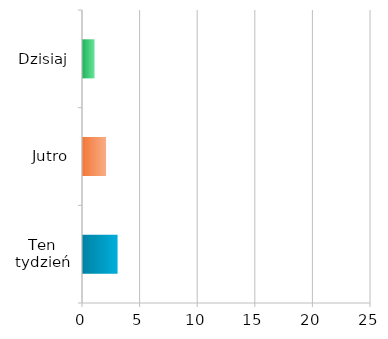
| Category | Series 0 |
|---|---|
| Ten tydzień | 3 |
| Jutro | 2 |
| Dzisiaj | 1 |